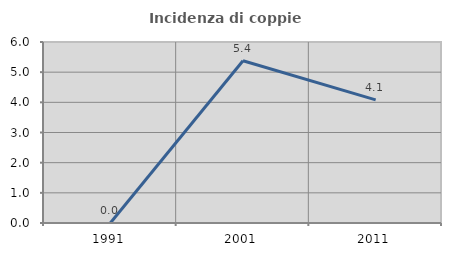
| Category | Incidenza di coppie miste |
|---|---|
| 1991.0 | 0 |
| 2001.0 | 5.376 |
| 2011.0 | 4.082 |